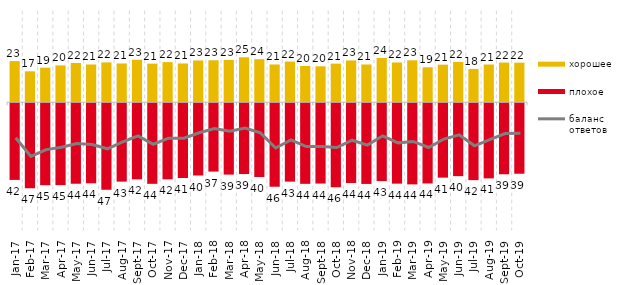
| Category | хорошее | плохое |
|---|---|---|
| 2017-01-01 | 22.55 | -42 |
| 2017-02-01 | 16.95 | -46.6 |
| 2017-03-01 | 18.95 | -44.9 |
| 2017-04-01 | 20.2 | -44.85 |
| 2017-05-01 | 21.5 | -44.1 |
| 2017-06-01 | 20.7 | -43.85 |
| 2017-07-01 | 21.85 | -47.35 |
| 2017-08-01 | 21.25 | -42.95 |
| 2017-09-01 | 23.3 | -41.7 |
| 2017-10-01 | 21.15 | -44.15 |
| 2017-11-01 | 22 | -41.7 |
| 2017-12-01 | 21.25 | -40.95 |
| 2018-01-01 | 22.9 | -39.6 |
| 2018-02-01 | 23 | -37.45 |
| 2018-03-01 | 23.2 | -39.1 |
| 2018-04-01 | 24.65 | -38.8 |
| 2018-05-01 | 23.6 | -40.4 |
| 2018-06-01 | 20.7 | -45.75 |
| 2018-07-01 | 22.3 | -42.95 |
| 2018-08-01 | 19.85 | -44.15 |
| 2018-09-01 | 19.7 | -44 |
| 2018-10-01 | 21.15 | -46 |
| 2018-11-01 | 22.904 | -43.713 |
| 2018-12-01 | 20.7 | -44.2 |
| 2019-01-01 | 24.25 | -42.65 |
| 2019-02-01 | 21.8 | -44.05 |
| 2019-03-01 | 22.974 | -44.455 |
| 2019-04-01 | 19.158 | -43.96 |
| 2019-05-01 | 20.604 | -40.763 |
| 2019-06-01 | 22.095 | -39.95 |
| 2019-07-01 | 18.267 | -42.129 |
| 2019-08-01 | 20.679 | -41.159 |
| 2019-09-01 | 21.733 | -38.911 |
| 2019-10-01 | 21.683 | -38.614 |